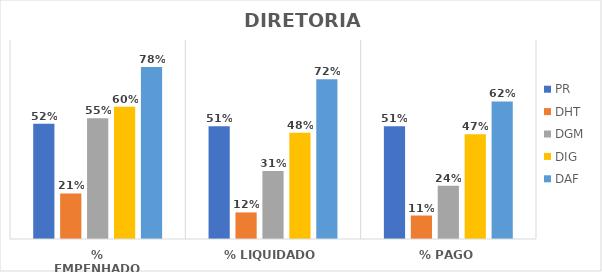
| Category | PR | DHT | DGM | DIG | DAF |
|---|---|---|---|---|---|
| % EMPENHADO | 0.521 | 0.206 | 0.546 | 0.598 | 0.778 |
| % LIQUIDADO | 0.51 | 0.12 | 0.307 | 0.481 | 0.723 |
| % PAGO | 0.51 | 0.106 | 0.241 | 0.474 | 0.622 |